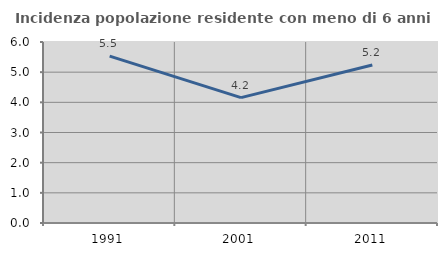
| Category | Incidenza popolazione residente con meno di 6 anni |
|---|---|
| 1991.0 | 5.53 |
| 2001.0 | 4.156 |
| 2011.0 | 5.237 |